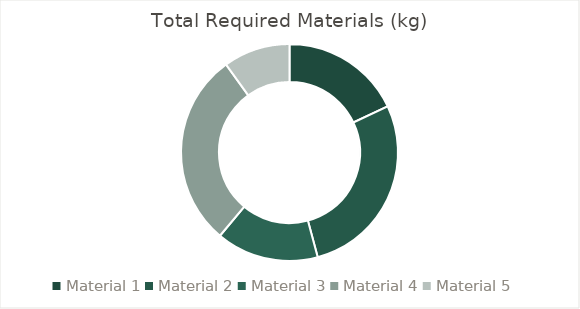
| Category | Total Required Materials (kg) |
|---|---|
| Material 1 | 59225 |
| Material 2 | 91412.5 |
| Material 3 | 50212.5 |
| Material 4 | 95275 |
| Material 5 | 32702.5 |